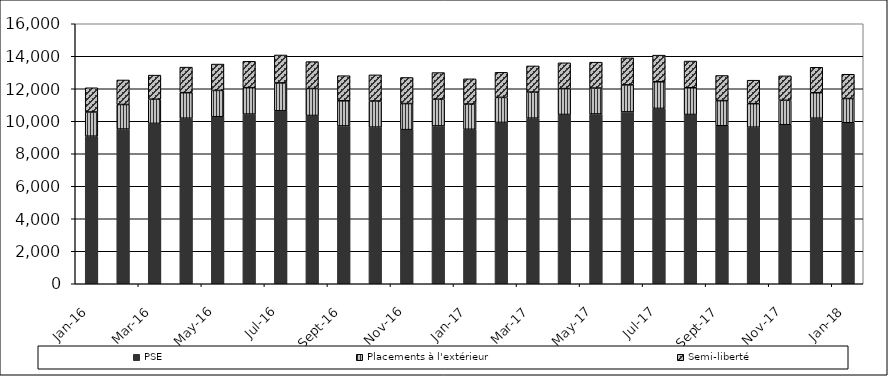
| Category | PSE | Placements à l'extérieur | Semi-liberté |
|---|---|---|---|
| 2016-01-01 | 9081 | 1490 | 1490 |
| 2016-02-01 | 9521 | 1510 | 1510 |
| 2016-03-01 | 9868 | 1486 | 1486 |
| 2016-04-01 | 10187 | 1572 | 1572 |
| 2016-05-01 | 10278 | 1621 | 1621 |
| 2016-06-01 | 10441 | 1625 | 1625 |
| 2016-07-01 | 10642 | 1718 | 1718 |
| 2016-08-01 | 10355 | 1658 | 1658 |
| 2016-09-01 | 9712 | 1546 | 1546 |
| 2016-10-01 | 9640 | 1607 | 1607 |
| 2016-11-01 | 9484 | 1605 | 1605 |
| 2016-12-01 | 9714 | 1641 | 1641 |
| 2017-01-01 | 9505 | 1553 | 1553 |
| 2017-02-01 | 9927 | 1542 | 1542 |
| 2017-03-01 | 10190 | 1607 | 1607 |
| 2017-04-01 | 10417 | 1590 | 1590 |
| 2017-05-01 | 10448 | 1594 | 1594 |
| 2017-06-01 | 10575 | 1664 | 1664 |
| 2017-07-01 | 10791 | 1639 | 1639 |
| 2017-08-01 | 10417 | 1644 | 1644 |
| 2017-09-01 | 9723 | 1547 | 1547 |
| 2017-10-01 | 9637 | 1445 | 1445 |
| 2017-11-01 | 9787 | 1504 | 1504 |
| 2017-12-01 | 10187 | 1568 | 1568 |
| 2018-01-01 | 9907 | 1493 | 1493 |